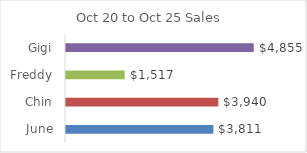
| Category | Total |
|---|---|
| June | 3811 |
| Chin | 3940 |
| Freddy | 1517 |
| Gigi | 4855 |